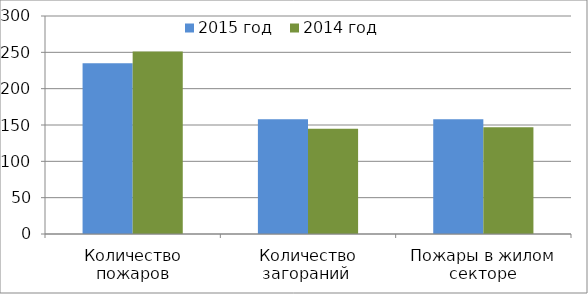
| Category | 2015 год | 2014 год |
|---|---|---|
| Количество пожаров | 235 | 251 |
| Количество загораний  | 158 | 145 |
| Пожары в жилом секторе | 158 | 147 |